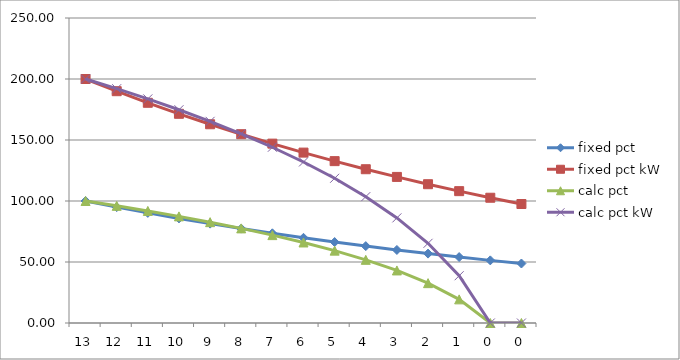
| Category | fixed pct | fixed pct kW | calc pct | calc pct kW |
|---|---|---|---|---|
| 13.0 | 100 | 200 | 100 | 200 |
| 12.0 | 95 | 190 | 96.033 | 192.067 |
| 11.0 | 90.25 | 180.5 | 91.843 | 183.685 |
| 10.0 | 85.738 | 171.475 | 87.395 | 174.79 |
| 9.0 | 81.451 | 162.901 | 82.649 | 165.298 |
| 8.0 | 77.378 | 154.756 | 77.551 | 155.102 |
| 7.0 | 73.509 | 147.018 | 72.032 | 144.064 |
| 6.0 | 69.834 | 139.667 | 65.996 | 131.993 |
| 5.0 | 66.342 | 132.684 | 59.311 | 118.622 |
| 4.0 | 63.025 | 126.05 | 51.777 | 103.555 |
| 3.0 | 59.874 | 119.747 | 43.079 | 86.158 |
| 2.0 | 56.88 | 113.76 | 32.661 | 65.321 |
| 1.0 | 54.036 | 108.072 | 19.374 | 38.749 |
| 0.0 | 51.334 | 102.668 | 0 | 0 |
| 0.0 | 48.767 | 97.535 | 0 | 0 |